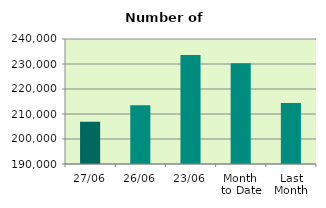
| Category | Series 0 |
|---|---|
| 27/06 | 206950 |
| 26/06 | 213526 |
| 23/06 | 233608 |
| Month 
to Date | 230312.211 |
| Last
Month | 214383.182 |